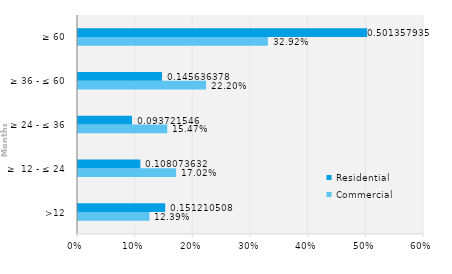
| Category | Commercial | Residential |
|---|---|---|
| >12 | 0.124 | 0.151 |
| ≥  12 - ≤ 24 | 0.17 | 0.108 |
| ≥ 24 - ≤ 36 | 0.155 | 0.094 |
| ≥ 36 - ≤ 60 | 0.222 | 0.146 |
| ≥ 60 | 0.329 | 0.501 |